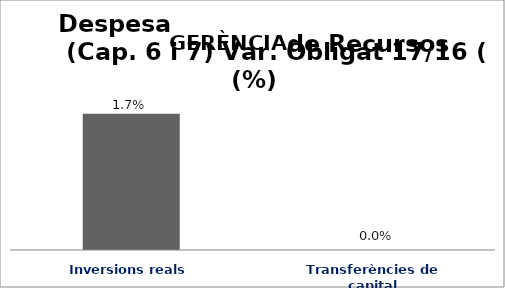
| Category | Series 0 |
|---|---|
| Inversions reals | 0.017 |
| Transferències de capital | 0 |